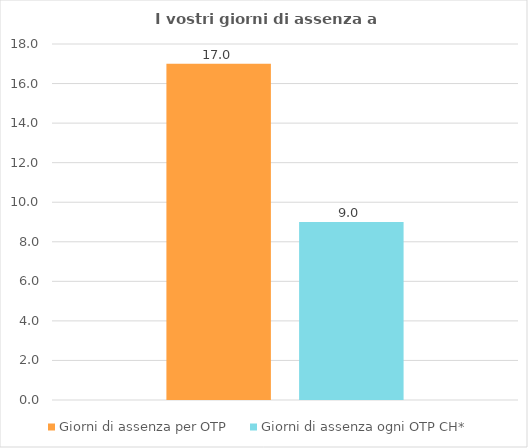
| Category | Giorni di assenza per OTP   | Giorni di assenza ogni OTP CH*  |
|---|---|---|
| 0 | 17 | 9 |